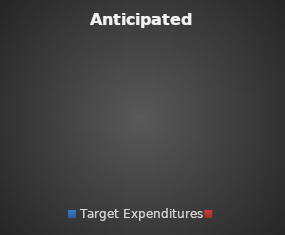
| Category | Series 0 |
|---|---|
| Target Expenditures | 0 |